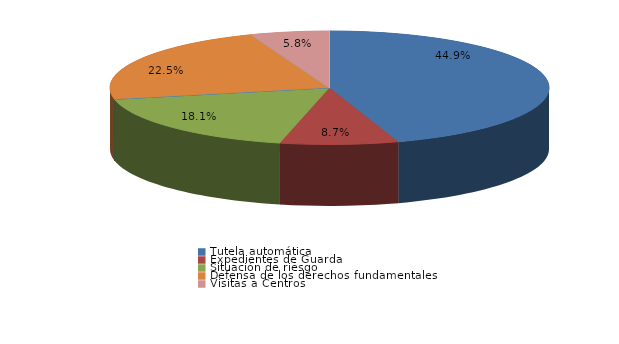
| Category | Series 0 |
|---|---|
| Tutela automática | 62 |
| Expedientes de Guarda | 12 |
| Situación de riesgo | 25 |
| Intervención en acogimientos | 0 |
| Intervención en adopciones | 0 |
| Defensa de los derechos fundamentales | 31 |
| Sustracción internacional de menores | 0 |
| Visitas a Centros | 8 |
| Ensayos Clínicos | 0 |
| Impugnación a instacia del Fiscal | 0 |
| Impugnación a instancia de particulares | 0 |